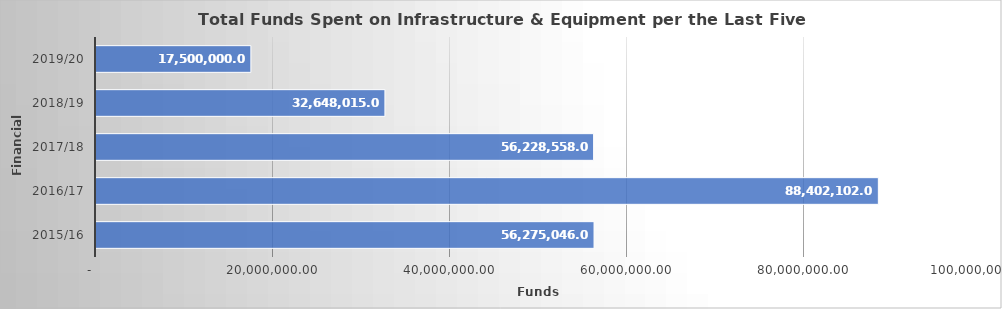
| Category | GRAND TOTAL |
|---|---|
| 2015/16 | 56275046 |
| 2016/17 | 88402102 |
| 2017/18 | 56228558 |
| 2018/19 | 32648015 |
| 2019/20 | 17500000 |